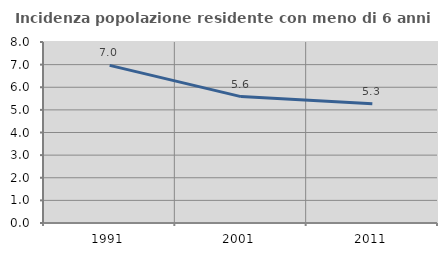
| Category | Incidenza popolazione residente con meno di 6 anni |
|---|---|
| 1991.0 | 6.966 |
| 2001.0 | 5.586 |
| 2011.0 | 5.275 |